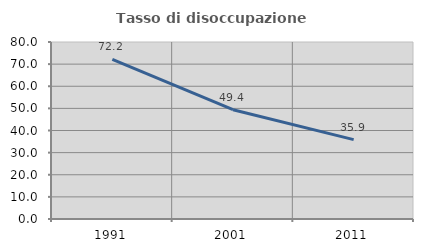
| Category | Tasso di disoccupazione giovanile  |
|---|---|
| 1991.0 | 72.165 |
| 2001.0 | 49.412 |
| 2011.0 | 35.885 |